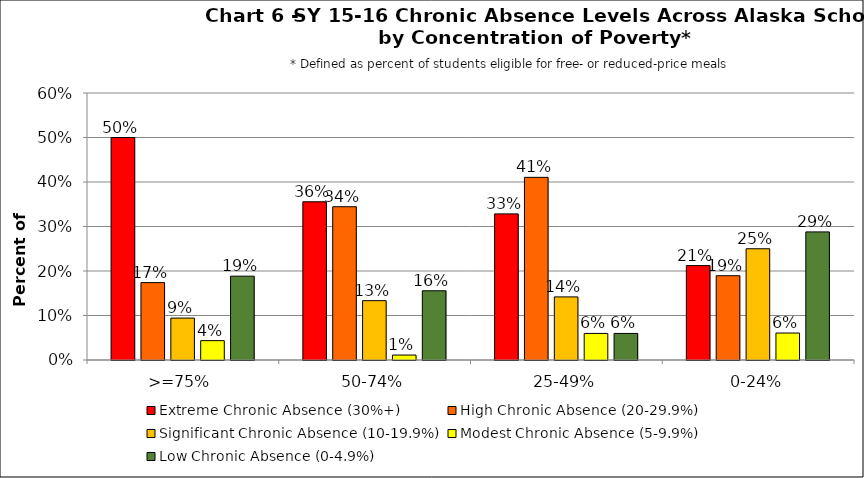
| Category | Extreme Chronic Absence (30%+) | High Chronic Absence (20-29.9%) | Significant Chronic Absence (10-19.9%) | Modest Chronic Absence (5-9.9%) | Low Chronic Absence (0-4.9%) |
|---|---|---|---|---|---|
| 0 | 0.5 | 0.174 | 0.094 | 0.043 | 0.188 |
| 1 | 0.356 | 0.344 | 0.133 | 0.011 | 0.156 |
| 2 | 0.328 | 0.41 | 0.142 | 0.06 | 0.06 |
| 3 | 0.212 | 0.189 | 0.25 | 0.061 | 0.288 |